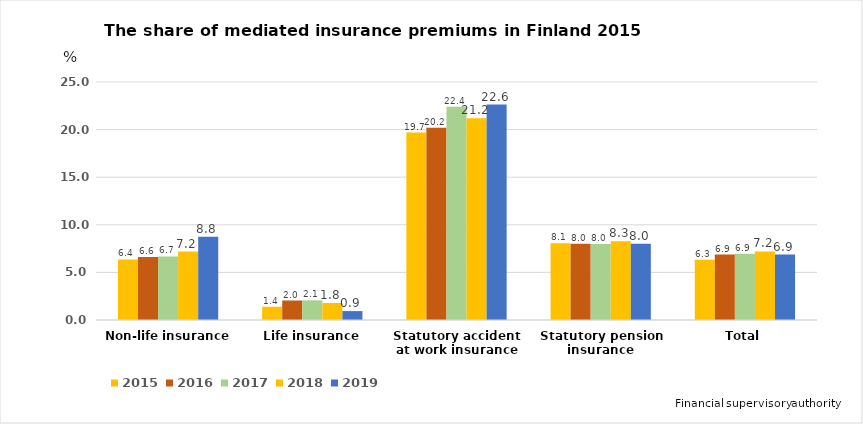
| Category | 2015 | 2016 | 2017 | 2018 | 2019 |
|---|---|---|---|---|---|
| Non-life insurance | 6.356 | 6.621 | 6.681 | 7.184 | 8.751 |
| Life insurance | 1.39 | 2.047 | 2.067 | 1.786 | 0.938 |
| Statutory accident at work insurance | 19.692 | 20.194 | 22.408 | 21.186 | 22.632 |
| Statutory pension insurance | 8.075 | 8.016 | 7.982 | 8.268 | 8.015 |
| Total | 6.337 | 6.875 | 6.948 | 7.208 | 6.878 |